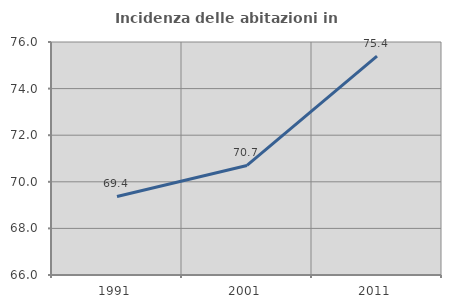
| Category | Incidenza delle abitazioni in proprietà  |
|---|---|
| 1991.0 | 69.369 |
| 2001.0 | 70.702 |
| 2011.0 | 75.39 |